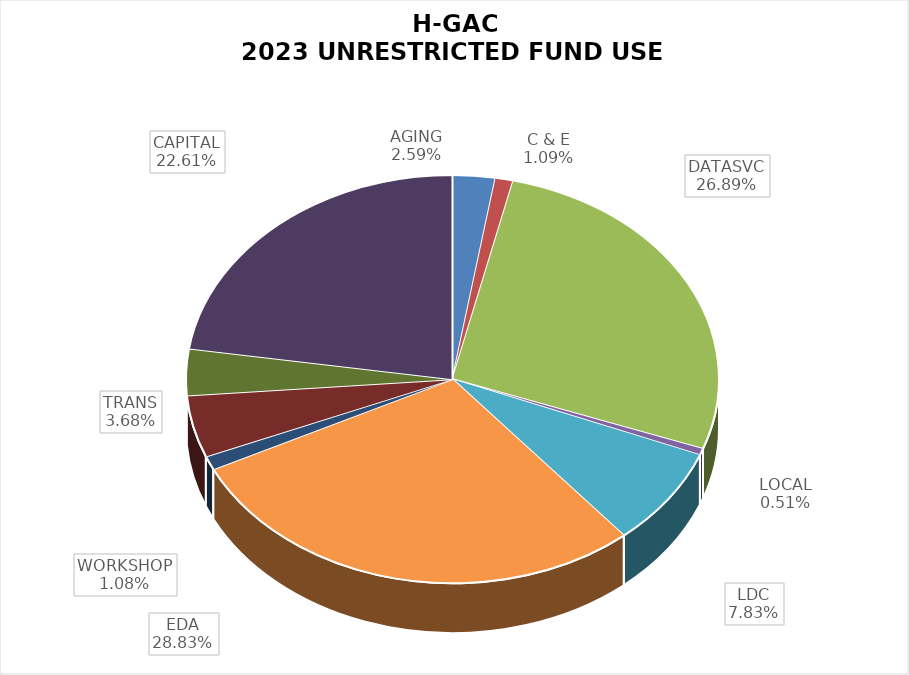
| Category | Series 0 |
|---|---|
| AGING | 0.026 |
| C & E | 0.011 |
| DATASVC | 0.269 |
| LOCAL | 0.005 |
| LDC | 0.078 |
| EDA | 0.288 |
| WORKSHOP | 0.011 |
| SHARED SVCS | 0.049 |
| TRANS | 0.037 |
| CAPITAL | 0.226 |